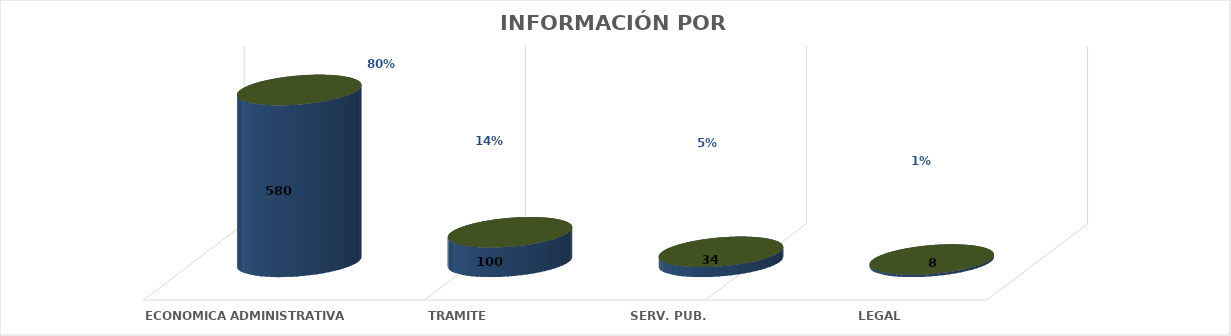
| Category | Series 0 | Series 1 | Series 2 | Series 3 | Series 4 |
|---|---|---|---|---|---|
| ECONOMICA ADMINISTRATIVA |  |  |  | 580 | 0.803 |
| TRAMITE |  |  |  | 100 | 0.139 |
| SERV. PUB. |  |  |  | 34 | 0.047 |
| LEGAL |  |  |  | 8 | 0.011 |